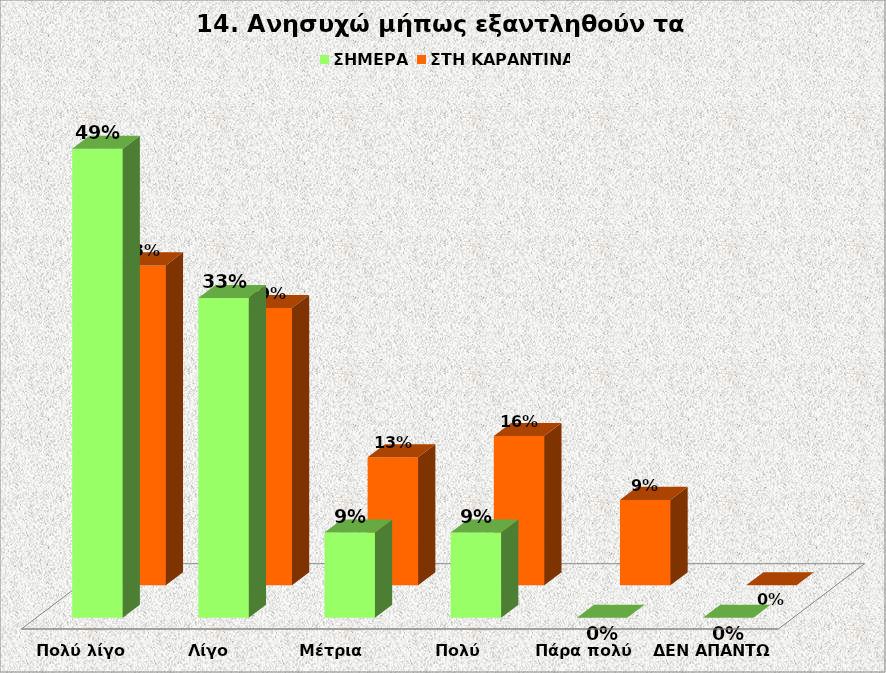
| Category | Series 0 | ΣΗΜΕΡΑ  | ΣΤΗ ΚΑΡΑΝΤΙΝΑ |
|---|---|---|---|
| Πολύ λίγο |  | 0.489 | 0.333 |
| Λίγο |  | 0.333 | 0.289 |
| Μέτρια  |  | 0.089 | 0.133 |
| Πολύ  |  | 0.089 | 0.156 |
| Πάρα πολύ  |  | 0 | 0.089 |
| ΔΕΝ ΑΠΑΝΤΩ |  | 0 | 0 |